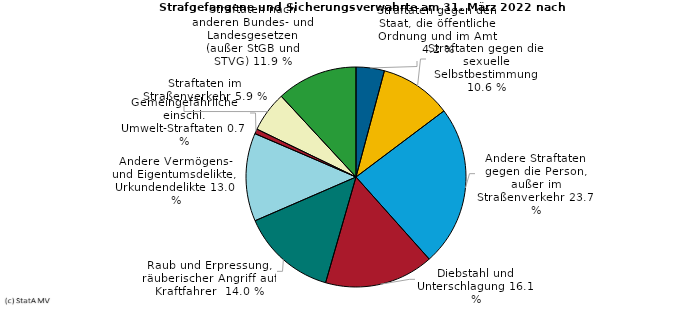
| Category | Series 0 |
|---|---|
| Straftaten gegen den Staat, die öffentliche Ordnung und im Amt | 4.162 |
| Straftaten gegen die sexuelle Selbstbestimmung | 10.583 |
| Andere Straftaten gegen die Person, außer im Straßenverkehr | 23.662 |
| Diebstahl und Unterschlagung | 16.052 |
| Raub und Erpressung, räuberischer Angriff auf Kraftfahrer  | 14.031 |
| Andere Vermögens- und Eigentumsdelikte, Urkundendelikte | 12.961 |
| Gemeingefährliche einschl. Umwelt-Straftaten | 0.713 |
| Straftaten im Straßenverkehr | 5.945 |
| Straftaten nach anderen Bundes- und Landesgesetzen (außer StGB und STVG) | 11.891 |